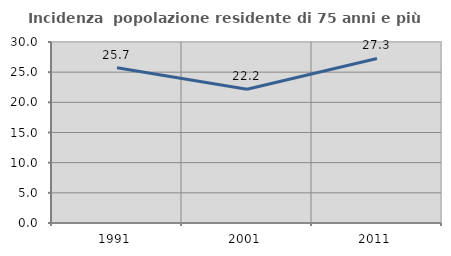
| Category | Incidenza  popolazione residente di 75 anni e più |
|---|---|
| 1991.0 | 25.749 |
| 2001.0 | 22.156 |
| 2011.0 | 27.273 |